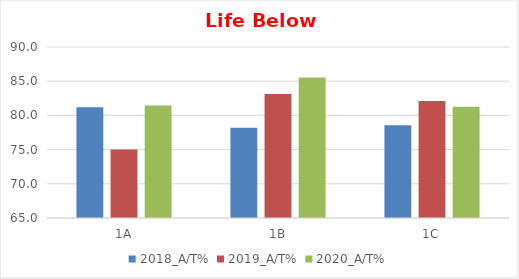
| Category | 2018_A/T% | 2019_A/T% | 2020_A/T% |
|---|---|---|---|
| 1A | 81.176 | 75 | 81.443 |
| 1B | 78.205 | 83.146 | 85.556 |
| 1C | 78.571 | 82.105 | 81.25 |